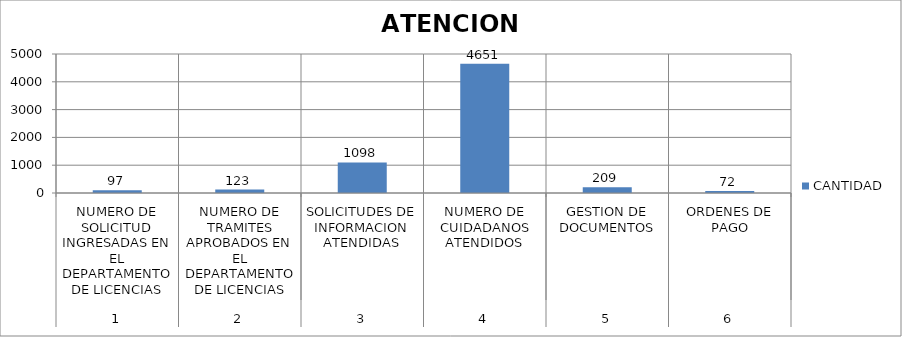
| Category | CANTIDAD |
|---|---|
| 0 | 97 |
| 1 | 123 |
| 2 | 1098 |
| 3 | 4651 |
| 4 | 209 |
| 5 | 72 |